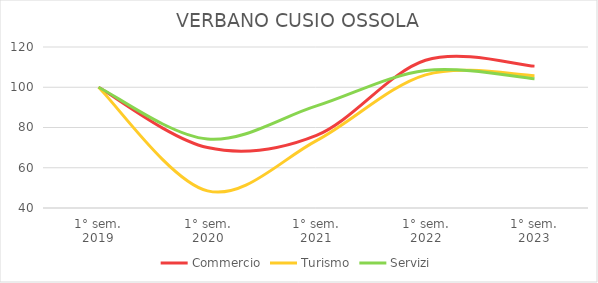
| Category | Commercio | Turismo | Servizi |
|---|---|---|---|
| 1° sem.
2019 | 100 | 100 | 100 |
| 1° sem.
2020 | 70.045 | 48.517 | 74.259 |
| 1° sem.
2021 | 76.109 | 73.471 | 90.731 |
| 1° sem.
2022 | 113.394 | 106.17 | 108.345 |
| 1° sem.
2023 | 110.498 | 105.767 | 104.186 |